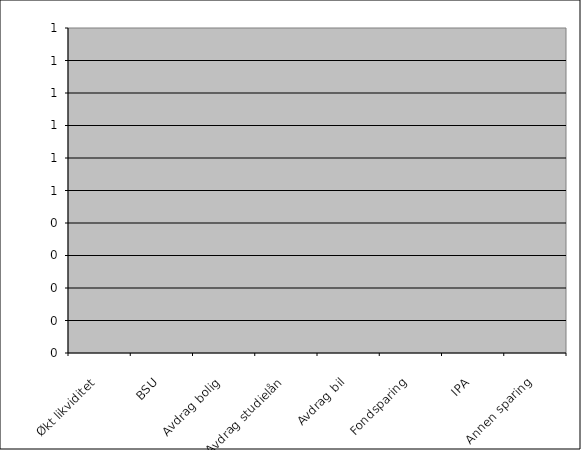
| Category | Series 0 |
|---|---|
| Økt likviditet | 0 |
| BSU | 0 |
| Avdrag bolig | 0 |
| Avdrag studielån | 0 |
| Avdrag bil | 0 |
| Fondsparing | 0 |
| IPA | 0 |
| Annen sparing | 0 |